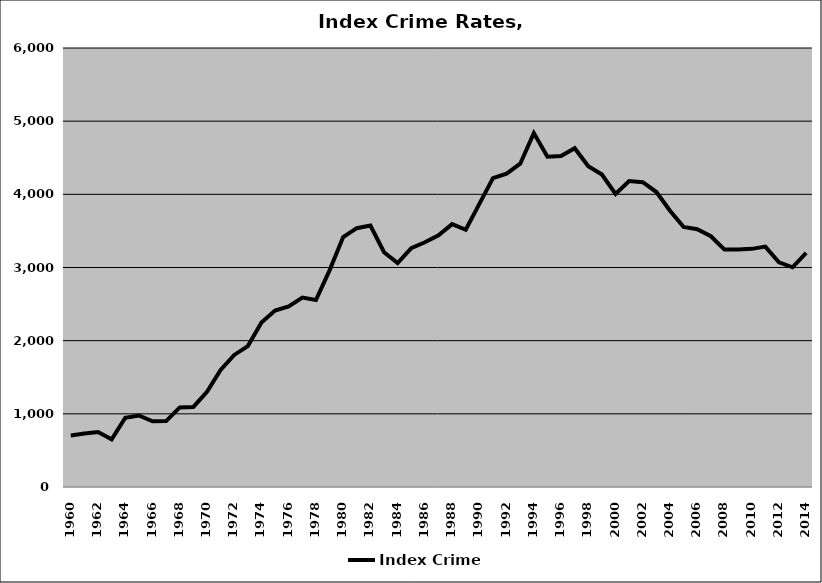
| Category | Index Crime |
|---|---|
| 1960.0 | 704.683 |
| 1961.0 | 732.099 |
| 1962.0 | 752.18 |
| 1963.0 | 650.83 |
| 1964.0 | 946.586 |
| 1965.0 | 977.208 |
| 1966.0 | 897.207 |
| 1967.0 | 900.17 |
| 1968.0 | 1087.233 |
| 1969.0 | 1094.583 |
| 1970.0 | 1302.352 |
| 1971.0 | 1600.494 |
| 1972.0 | 1805.303 |
| 1973.0 | 1926.304 |
| 1974.0 | 2249.182 |
| 1975.0 | 2410.742 |
| 1976.0 | 2468.309 |
| 1977.0 | 2588.573 |
| 1978.0 | 2554.867 |
| 1979.0 | 2960.64 |
| 1980.0 | 3417.173 |
| 1981.0 | 3537.352 |
| 1982.0 | 3572.599 |
| 1983.0 | 3208.156 |
| 1984.0 | 3059.854 |
| 1985.0 | 3265.71 |
| 1986.0 | 3345.067 |
| 1987.0 | 3438.59 |
| 1988.0 | 3592.844 |
| 1989.0 | 3515.3 |
| 1990.0 | 3869.127 |
| 1991.0 | 4220.756 |
| 1992.0 | 4282.479 |
| 1993.0 | 4418.275 |
| 1994.0 | 4837.055 |
| 1995.0 | 4514.461 |
| 1996.0 | 4522.901 |
| 1997.0 | 4630.245 |
| 1998.0 | 4383.975 |
| 1999.0 | 4270.396 |
| 2000.0 | 4004.383 |
| 2001.0 | 4182.733 |
| 2002.0 | 4166.485 |
| 2003.0 | 4031.196 |
| 2004.0 | 3776.517 |
| 2005.0 | 3553.796 |
| 2006.0 | 3522.336 |
| 2007.0 | 3427.659 |
| 2008.0 | 3244.562 |
| 2009.0 | 3244.517 |
| 2010.0 | 3254.713 |
| 2011.0 | 3285.287 |
| 2012.0 | 3070.602 |
| 2013.0 | 3002.835 |
| 2014.0 | 3199.648 |